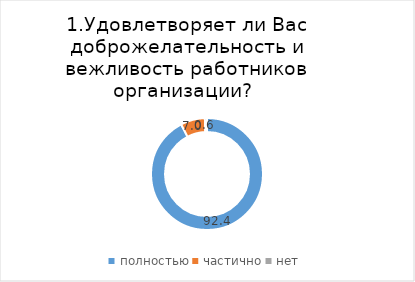
| Category | Стрежевой |
|---|---|
| полностью | 92.355 |
| частично | 7.025 |
| нет | 0.62 |